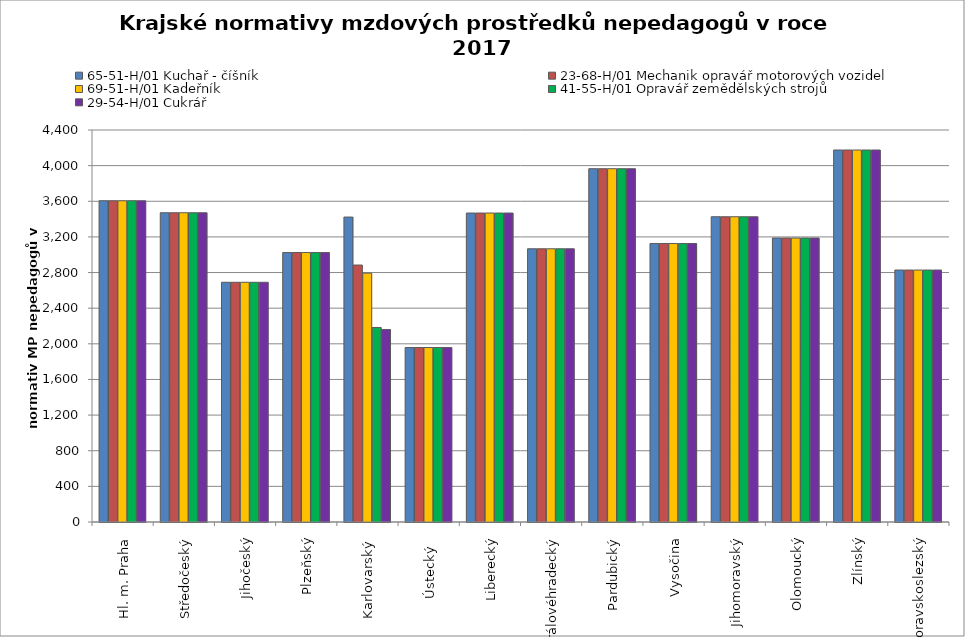
| Category | 65-51-H/01 Kuchař - číšník | 23-68-H/01 Mechanik opravář motorových vozidel | 69-51-H/01 Kadeřník | 41-55-H/01 Opravář zemědělských strojů | 29-54-H/01 Cukrář |
|---|---|---|---|---|---|
| Hl. m. Praha | 3605.806 | 3605.806 | 3605.806 | 3605.806 | 3605.806 |
| Středočeský | 3471.309 | 3471.309 | 3471.309 | 3471.309 | 3471.309 |
| Jihočeský | 2690.773 | 2690.773 | 2690.773 | 2690.773 | 2690.773 |
| Plzeňský | 3024.545 | 3024.545 | 3024.545 | 3024.545 | 3024.545 |
| Karlovarský  | 3422.819 | 2884.298 | 2793.245 | 2183.427 | 2160.254 |
| Ústecký   | 1958.474 | 1958.474 | 1958.474 | 1958.474 | 1958.474 |
| Liberecký | 3467.889 | 3467.889 | 3467.889 | 3467.889 | 3467.889 |
| Královéhradecký | 3066.898 | 3066.898 | 3066.898 | 3066.898 | 3066.898 |
| Pardubický | 3965.455 | 3965.455 | 3965.455 | 3965.455 | 3965.455 |
| Vysočina | 3125.692 | 3125.692 | 3125.692 | 3125.692 | 3125.692 |
| Jihomoravský | 3426.326 | 3426.326 | 3426.326 | 3426.326 | 3426.326 |
| Olomoucký | 3187.482 | 3187.482 | 3187.482 | 3187.482 | 3187.482 |
| Zlínský | 4175.51 | 4175.51 | 4175.51 | 4175.51 | 4175.51 |
| Moravskoslezský | 2828.209 | 2828.209 | 2828.209 | 2828.209 | 2828.209 |